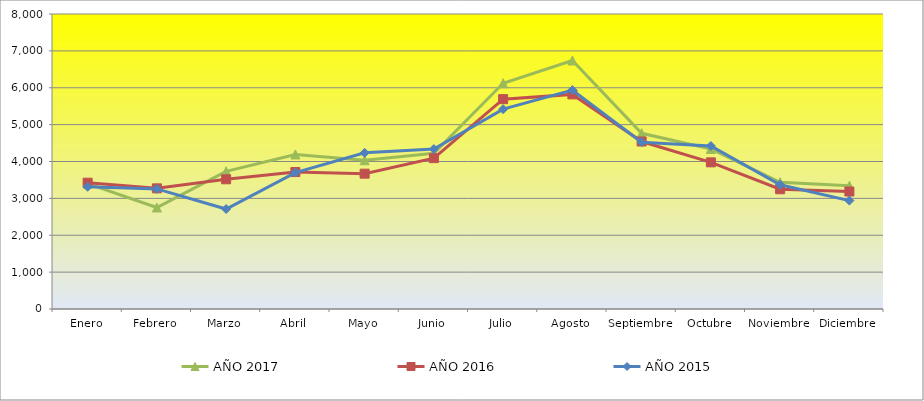
| Category | AÑO 2017 | AÑO 2016 | AÑO 2015 |
|---|---|---|---|
| Enero | 3398.54 | 3425 | 3314 |
| Febrero | 2752.555 | 3272 | 3257 |
| Marzo | 3733.577 | 3517 | 2711 |
| Abril | 4191.241 | 3714 | 3700 |
| Mayo | 4033.577 | 3670 | 4235 |
| Junio | 4221.898 | 4091 | 4337 |
| Julio | 6122.628 | 5691 | 5420 |
| Agosto | 6740.146 | 5820 | 5936 |
| Septiembre | 4764.964 | 4542 | 4524 |
| Octubre | 4340.132 | 3977 | 4421 |
| Noviembre | 3435.232 | 3247 | 3370 |
| Diciembre | 3341.606 | 3186 | 2940 |